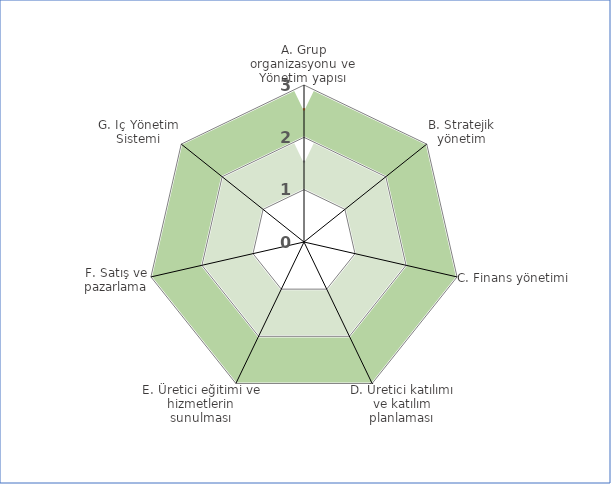
| Category | Series 1 | Series 0 | Series 2 |
|---|---|---|---|
| A. Grup organizasyonu ve Yönetim yapısı | 2.5 | 0 | 1.5 |
| B. Stratejik yönetim | 2.5 | 0 | 1.5 |
| C. Finans yönetimi | 2.5 | 0 | 1.5 |
| D. Üretici katılımı ve katılım planlaması | 2.5 | 0 | 1.5 |
| E. Üretici eğitimi ve hizmetlerin sunulması | 2.5 | 0 | 1.5 |
| F. Satış ve pazarlama | 2.5 | 0 | 1.5 |
| G. İç Yönetim Sistemi | 2.5 | 0 | 1.5 |